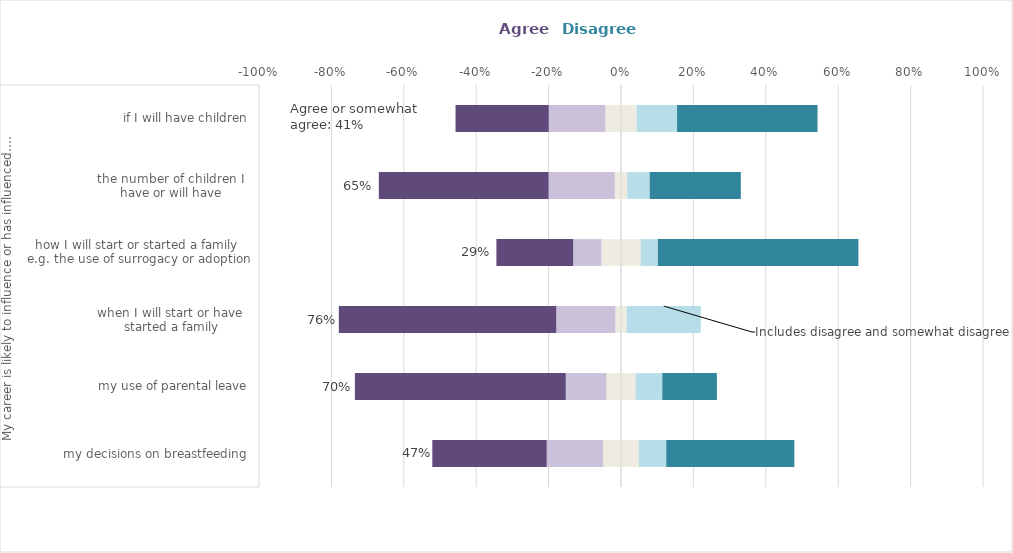
| Category | Neither agree nor disagree | Somewhat agree | Agree | Somewhat disagree | Disagree |
|---|---|---|---|---|---|
| 0 | 0.05 | -0.156 | -0.316 | 0.075 | 0.354 |
| 1 | 0.04 | -0.112 | -0.582 | 0.074 | 0.151 |
| 2 | 0.016 | -0.163 | -0.601 | 0.205 | 0 |
| 3 | 0.054 | -0.078 | -0.212 | 0.048 | 0.554 |
| 4 | 0.017 | -0.183 | -0.469 | 0.062 | 0.252 |
| 5 | 0.043 | -0.157 | -0.257 | 0.112 | 0.388 |